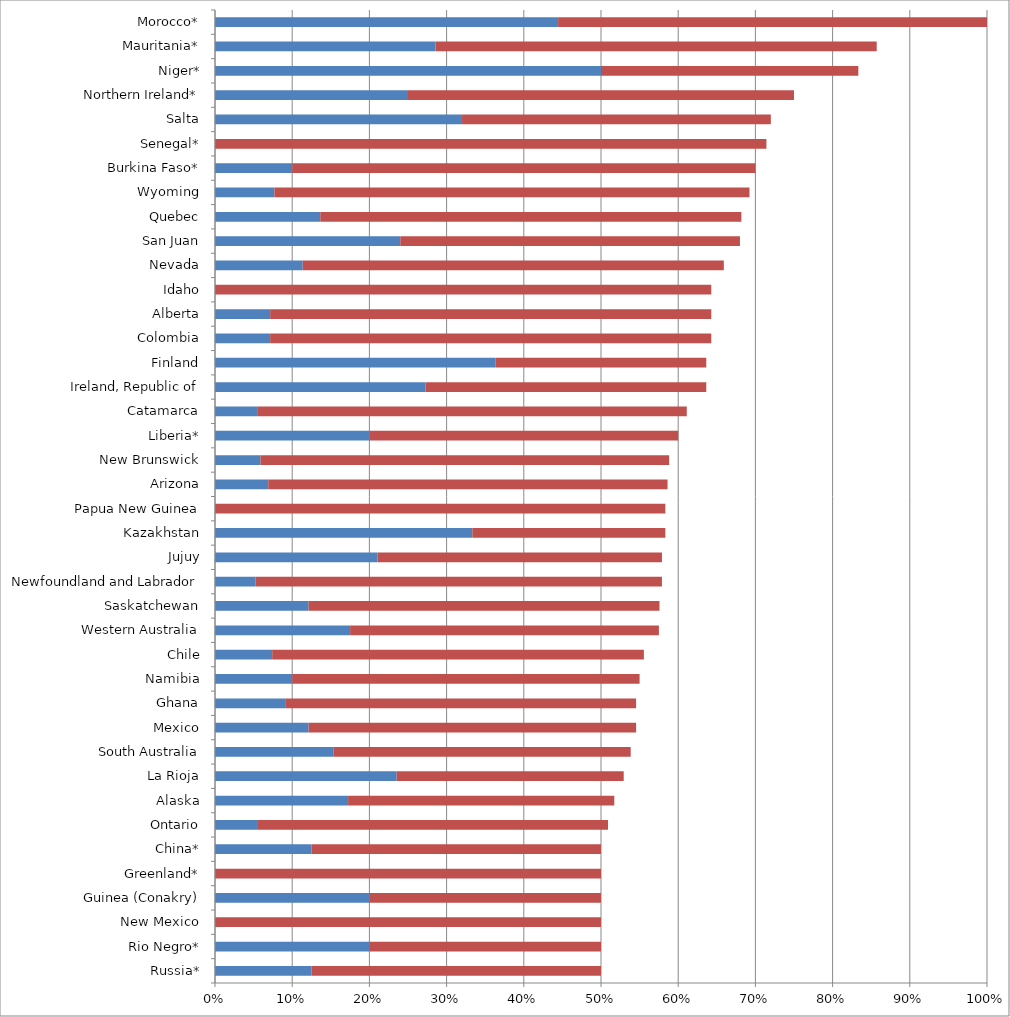
| Category | Series 0 | Series 1 |
|---|---|---|
| Russia* | 0.125 | 0.375 |
| Rio Negro* | 0.2 | 0.3 |
| New Mexico | 0 | 0.5 |
| Guinea (Conakry) | 0.2 | 0.3 |
| Greenland* | 0 | 0.5 |
| China* | 0.125 | 0.375 |
| Ontario | 0.055 | 0.455 |
| Alaska | 0.172 | 0.345 |
| La Rioja | 0.235 | 0.294 |
| South Australia | 0.154 | 0.385 |
| Mexico | 0.121 | 0.424 |
| Ghana | 0.091 | 0.455 |
| Namibia | 0.1 | 0.45 |
| Chile | 0.074 | 0.481 |
| Western Australia | 0.175 | 0.4 |
| Saskatchewan | 0.121 | 0.455 |
| Newfoundland and Labrador | 0.053 | 0.526 |
| Jujuy | 0.211 | 0.368 |
| Kazakhstan | 0.333 | 0.25 |
| Papua New Guinea | 0 | 0.583 |
| Arizona | 0.069 | 0.517 |
| New Brunswick | 0.059 | 0.529 |
| Liberia* | 0.2 | 0.4 |
| Catamarca | 0.056 | 0.556 |
| Ireland, Republic of | 0.273 | 0.364 |
| Finland | 0.364 | 0.273 |
| Colombia | 0.071 | 0.571 |
| Alberta | 0.071 | 0.571 |
| Idaho | 0 | 0.643 |
| Nevada | 0.114 | 0.545 |
| San Juan | 0.24 | 0.44 |
| Quebec | 0.136 | 0.545 |
| Wyoming | 0.077 | 0.615 |
| Burkina Faso* | 0.1 | 0.6 |
| Senegal* | 0 | 0.714 |
| Salta | 0.32 | 0.4 |
| Northern Ireland* | 0.25 | 0.5 |
| Niger* | 0.5 | 0.333 |
| Mauritania* | 0.286 | 0.571 |
| Morocco* | 0.444 | 0.556 |